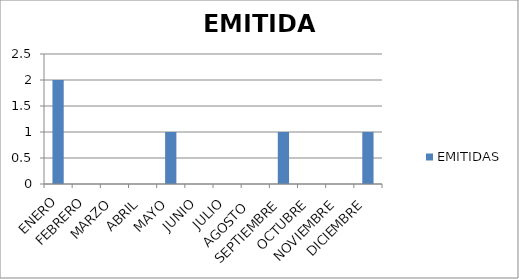
| Category | EMITIDAS |
|---|---|
| ENERO | 2 |
| FEBRERO | 0 |
| MARZO | 0 |
| ABRIL | 0 |
| MAYO | 1 |
| JUNIO | 0 |
| JULIO | 0 |
| AGOSTO  | 0 |
| SEPTIEMBRE | 1 |
| OCTUBRE | 0 |
| NOVIEMBRE | 0 |
| DICIEMBRE | 1 |